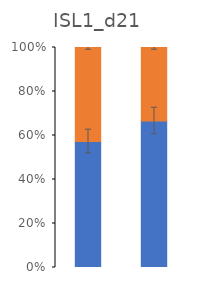
| Category | Series 0 | Series 1 |
|---|---|---|
| Chimpanzee | 57.262 | 42.738 |
| Human | 66.606 | 33.394 |